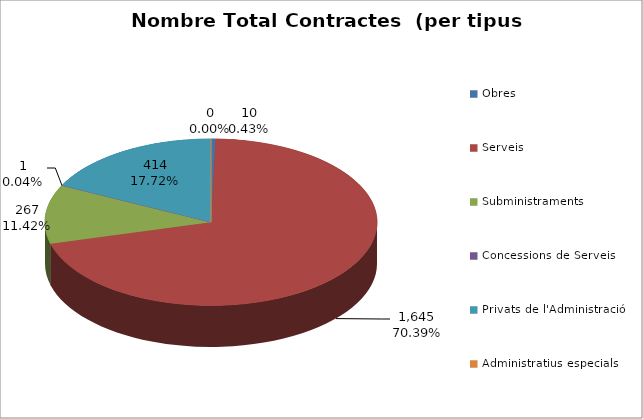
| Category | Nombre Total Contractes |
|---|---|
| Obres | 10 |
| Serveis | 1645 |
| Subministraments | 267 |
| Concessions de Serveis | 1 |
| Privats de l'Administració | 414 |
| Administratius especials | 0 |